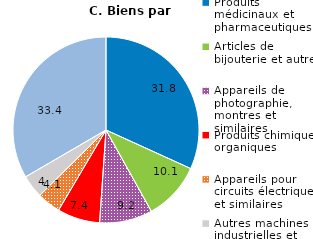
| Category | Exportation de biens par secteur |
|---|---|
| Produits médicinaux et pharmaceutiques |  |
| Articles de bijouterie et autres |  |
| Appareils de photographie, montres et similaires |  |
| Produits chimiques organiques |  |
| Appareils pour circuits électriques et similaires |  |
| Autres machines industrielles et pièces détachées |  |
| Autres |  |